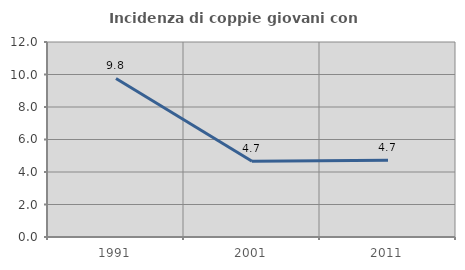
| Category | Incidenza di coppie giovani con figli |
|---|---|
| 1991.0 | 9.756 |
| 2001.0 | 4.663 |
| 2011.0 | 4.73 |